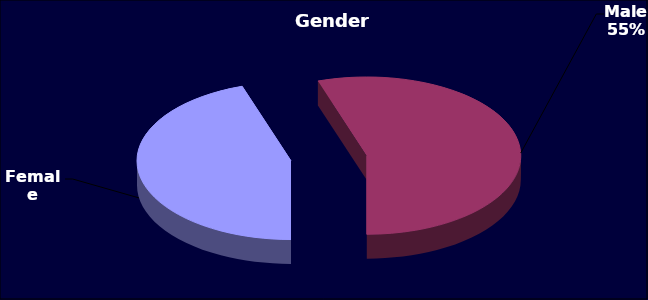
| Category | Series 0 |
|---|---|
| Female | 310 |
| Male | 381 |